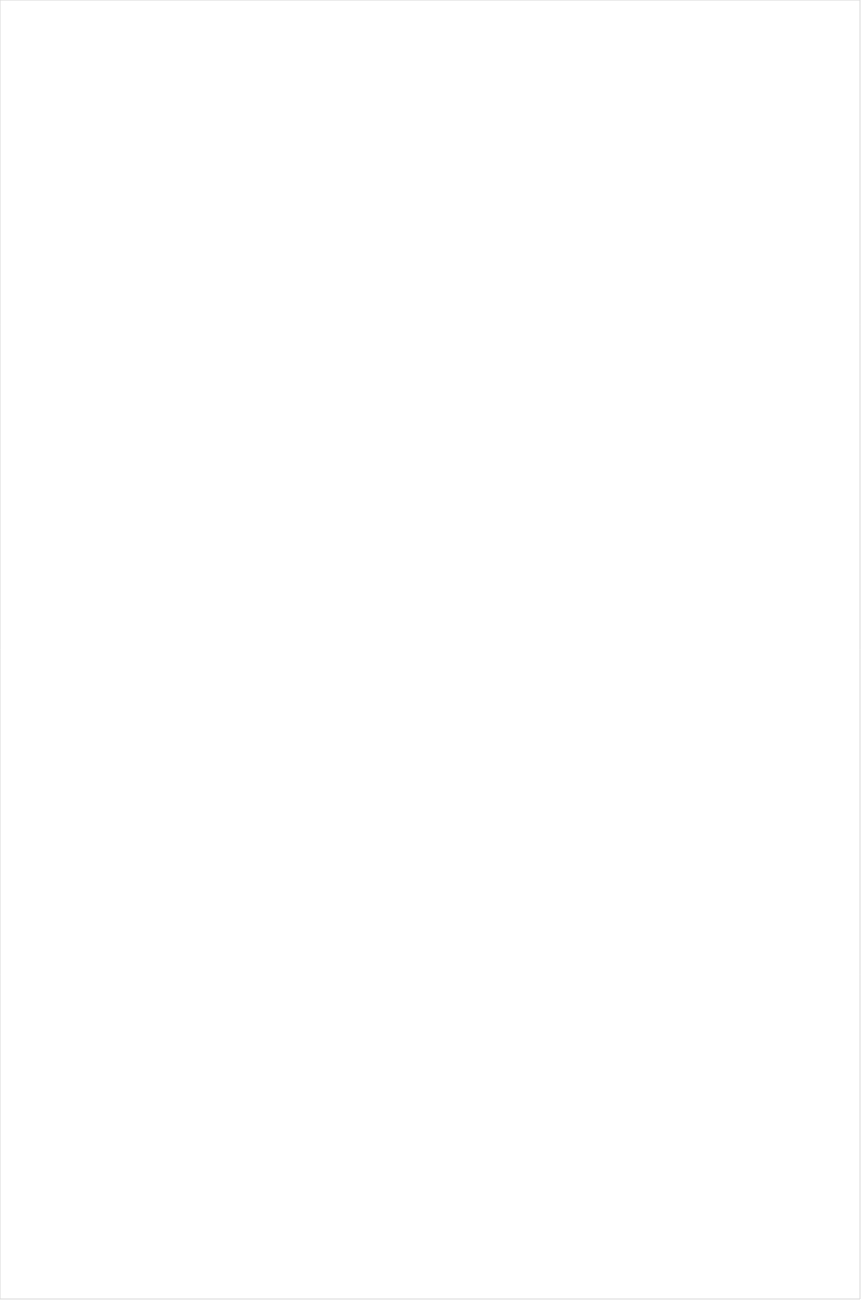
| Category | Total |
|---|---|
| Hallmark Movies & Mysteries | -0.546 |
| RFD TV | -0.514 |
| UniMas | -0.483 |
| Hallmark | -0.45 |
| Telemundo | -0.431 |
| Univision | -0.419 |
| PBS | -0.361 |
| Travel | -0.361 |
| Science Channel | -0.306 |
| MyNetworkTV | -0.288 |
| INSP | -0.26 |
| Fox News | -0.253 |
| UP TV | -0.252 |
| CMTV | -0.247 |
| Galavision | -0.208 |
| Fox Business | -0.205 |
| NBC Universo | -0.202 |
| Discovery Life Channel | -0.202 |
| CBS | -0.183 |
| TLC | -0.171 |
| Great American Country | -0.167 |
| Investigation Discovery | -0.165 |
| Animal Planet | -0.162 |
| POP | -0.153 |
| ION | -0.152 |
| Smithsonian | -0.129 |
| Outdoor Channel | -0.123 |
| History Channel | -0.113 |
| NBC | -0.112 |
| Weather Channel | -0.111 |
| National Geographic Wild | -0.09 |
| WGN America | -0.085 |
| Logo | -0.079 |
| Discovery Channel | -0.075 |
| DIY | -0.067 |
| TV LAND | -0.063 |
| HGTV | -0.059 |
| The Sportsman Channel | -0.056 |
| Motor Trend Network | -0.039 |
| CW | -0.026 |
| Nick@Nite | -0.02 |
| FYI | -0.011 |
| ABC | -0.008 |
| Headline News | 0 |
| FOX | 0.01 |
| SundanceTV | 0.011 |
| OXYGEN | 0.024 |
| Discovery Family Channel | 0.047 |
| A&E | 0.072 |
| Lifetime Movies | 0.096 |
| Disney XD | 0.096 |
| Cartoon Network | 0.108 |
| FX Movie Channel | 0.111 |
| Nick | 0.115 |
| E! | 0.116 |
| WE TV | 0.123 |
| Food Network | 0.132 |
| American Heroes Channel | 0.134 |
| Olympic Channel | 0.137 |
| Disney Junior US | 0.141 |
| Reelz Channel | 0.15 |
| BRAVO | 0.163 |
| National Geographic | 0.167 |
| Freeform | 0.181 |
| Nick Jr. | 0.181 |
| Ovation | 0.182 |
| Nick Toons | 0.183 |
| Adult Swim | 0.193 |
| Disney Channel | 0.213 |
| Universal Kids | 0.241 |
| AMC | 0.244 |
| TBS | 0.253 |
| TUDN | 0.264 |
| Destination America | 0.267 |
| FX | 0.282 |
| BBC America | 0.288 |
| SYFY | 0.29 |
| Oprah Winfrey Network | 0.332 |
| MSNBC | 0.337 |
| Teen Nick | 0.34 |
| Paramount Network | 0.342 |
| Bloomberg HD | 0.357 |
| Game Show | 0.376 |
| MTV | 0.398 |
| Lifetime | 0.407 |
| Independent Film (IFC) | 0.408 |
| USA Network | 0.42 |
| Comedy Central | 0.435 |
| FXX | 0.463 |
| Cooking Channel | 0.463 |
| CNBC | 0.484 |
| truTV | 0.484 |
| NHL | 0.511 |
| Viceland | 0.718 |
| TNT | 0.731 |
| CNN | 0.788 |
| Golf | 0.986 |
| VH1 | 1.031 |
| NBC Sports | 1.035 |
| ESPN Deportes | 1.042 |
| MLB Network | 1.179 |
| BET | 1.221 |
| CBS Sports | 1.246 |
| Big Ten Network | 1.34 |
| FXDEP | 1.355 |
| BET Her | 1.405 |
| MTV2 | 1.488 |
| TV ONE | 1.563 |
| Tennis Channel | 1.652 |
| PAC-12 Network | 1.93 |
| Fox Sports 1 | 2.052 |
| ESPNEWS | 2.537 |
| ESPNU | 2.567 |
| NFL Network | 2.569 |
| ESPN2 | 3.306 |
| ESPN | 4.067 |
| NBA TV | 7.279 |